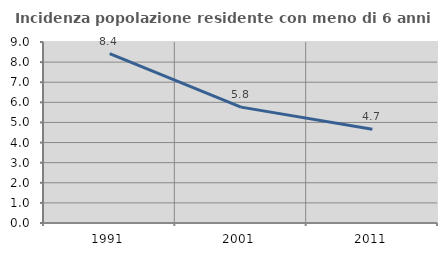
| Category | Incidenza popolazione residente con meno di 6 anni |
|---|---|
| 1991.0 | 8.421 |
| 2001.0 | 5.762 |
| 2011.0 | 4.665 |